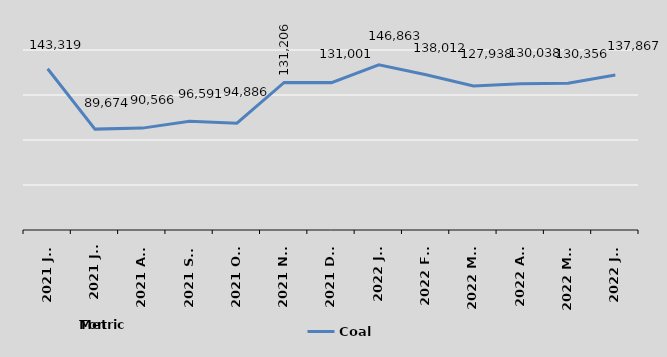
| Category | Coal  |
|---|---|
| 2021 Jun | 143319 |
| 2021 Jul | 89674 |
| 2021 Aug | 90566 |
| 2021 Sep | 96591 |
| 2021 Oct | 94886 |
| 2021 Nov | 131206 |
| 2021 Dec | 131001 |
| 2022 Jan | 146863 |
| 2022 Feb | 138012 |
| 2022 Mar | 127938 |
| 2022 Apr | 130038 |
| 2022 May | 130356 |
| 2022 Jun | 137867 |